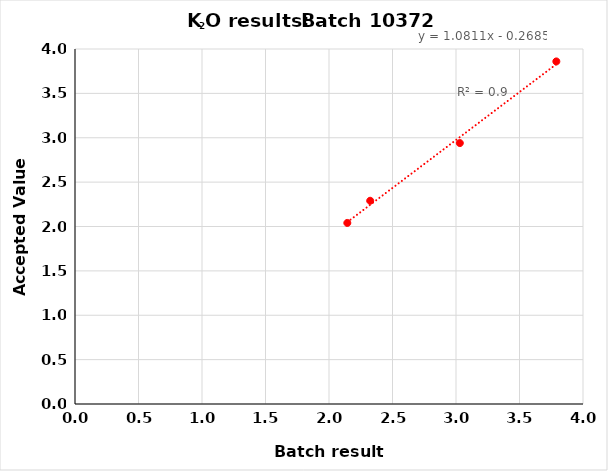
| Category | y |
|---|---|
| 2.3242857142857147 | 2.29 |
| 3.03 | 2.94 |
| 3.79 | 3.86 |
| 2.144285714285714 | 2.04 |